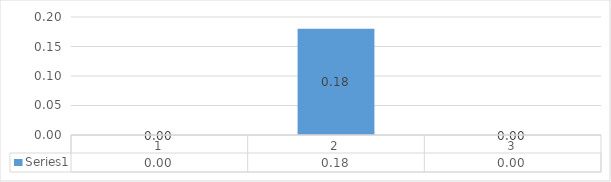
| Category | Series 0 |
|---|---|
| 0 | 0 |
| 1 | 0.18 |
| 2 | 0 |